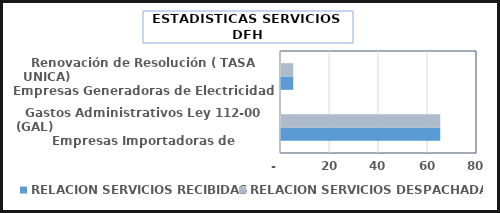
| Category | RELACION SERVICIOS |
|---|---|
| Gastos Administrativos Ley 112-00 (GAL)                                                     Empresas Importadoras de combustibles | 65 |
| Renovación de Resolución ( TASA UNICA)                                               Empresas Generadoras de Electricidad | 5 |